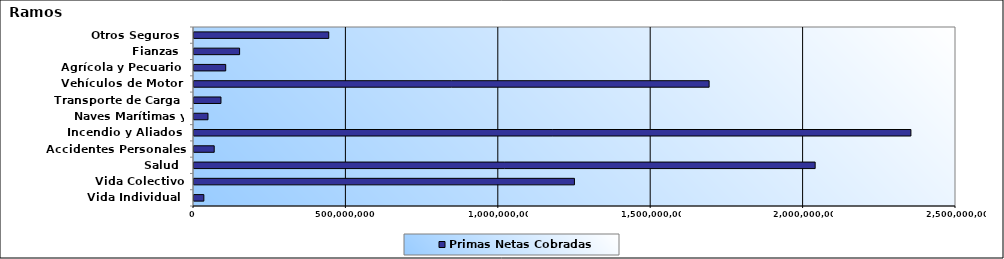
| Category | Primas Netas Cobradas |
|---|---|
| Vida Individual  | 32320657.72 |
| Vida Colectivo | 1248158331.62 |
| Salud  | 2037924228.4 |
| Accidentes Personales | 66328469.32 |
| Incendio y Aliados  | 2352085663.54 |
| Naves Marítimas y Aéreas  | 45917961.63 |
| Transporte de Carga  | 88441478.79 |
| Vehículos de Motor  | 1690064213.59 |
| Agrícola y Pecuario  | 104050765.77 |
| Fianzas  | 149635581.2 |
| Otros Seguros  | 442115802.27 |